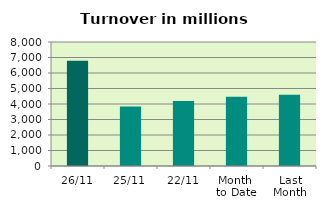
| Category | Series 0 |
|---|---|
| 26/11 | 6797.705 |
| 25/11 | 3831.904 |
| 22/11 | 4195.011 |
| Month 
to Date | 4471.787 |
| Last
Month | 4589.98 |